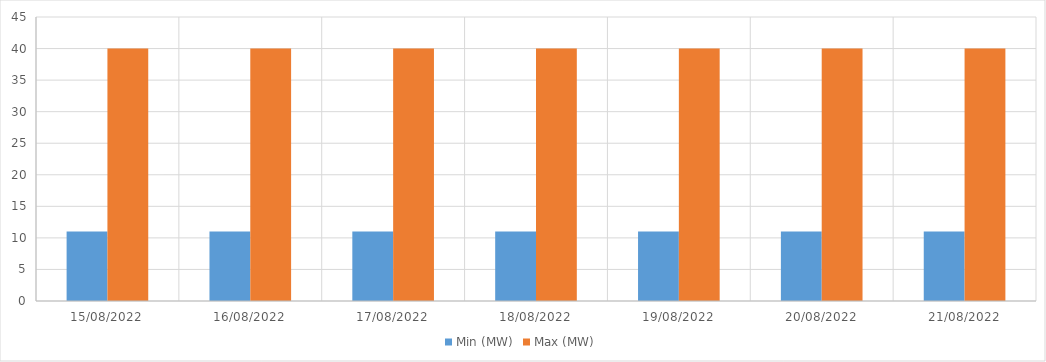
| Category | Min (MW) | Max (MW) |
|---|---|---|
| 15/08/2022 | 11 | 40 |
| 16/08/2022 | 11 | 40 |
| 17/08/2022 | 11 | 40 |
| 18/08/2022 | 11 | 40 |
| 19/08/2022 | 11 | 40 |
| 20/08/2022 | 11 | 40 |
| 21/08/2022 | 11 | 40 |